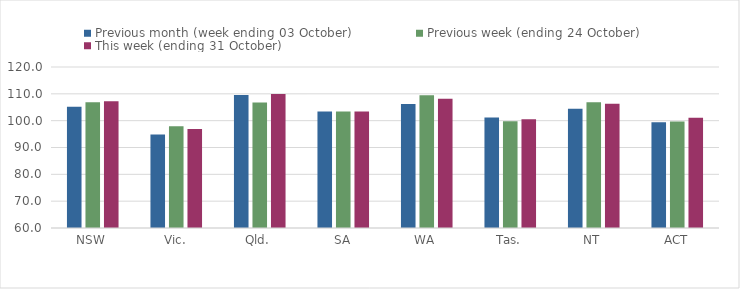
| Category | Previous month (week ending 03 October) | Previous week (ending 24 October) | This week (ending 31 October) |
|---|---|---|---|
| NSW | 105.21 | 106.86 | 107.2 |
| Vic. | 94.86 | 97.96 | 96.9 |
| Qld. | 109.55 | 106.79 | 109.95 |
| SA | 103.44 | 103.44 | 103.44 |
| WA | 106.24 | 109.47 | 108.19 |
| Tas. | 101.19 | 99.81 | 100.56 |
| NT | 104.41 | 106.82 | 106.33 |
| ACT | 99.45 | 99.65 | 101.12 |